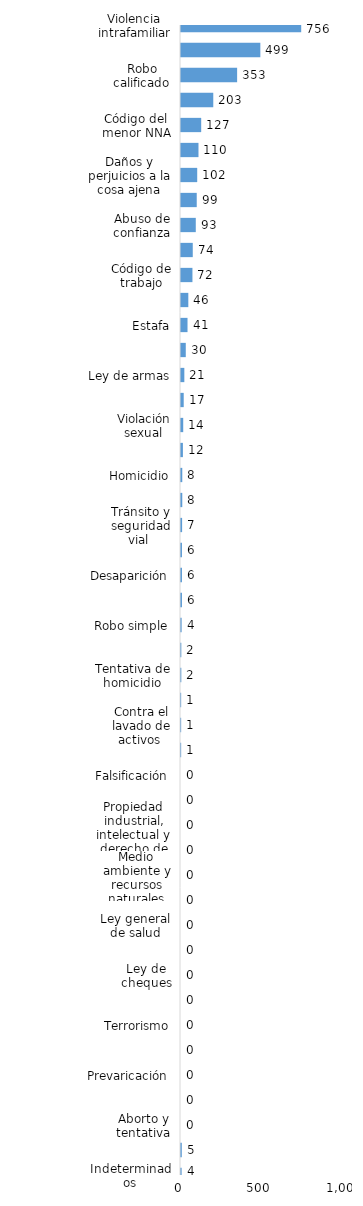
| Category | Series 0 |
|---|---|
| Violencia intrafamiliar | 756 |
| Amenaza | 499 |
| Robo calificado | 353 |
| Golpes y heridas | 203 |
| Código del menor NNA | 127 |
| Pérdida de documento de identidad | 110 |
| Daños y perjuicios a la cosa ajena | 102 |
| Crímenes y delitos de alta tecnología | 99 |
| Abuso de confianza | 93 |
| Asociación de malhechores | 74 |
| Código de trabajo | 72 |
| Violencia de género | 46 |
| Estafa | 41 |
| Droga, traficante de droga | 30 |
| Ley de armas | 21 |
| Agresión sexual | 17 |
| Violación sexual | 14 |
| Protección animal y tenencia responsable | 12 |
| Homicidio | 8 |
| Droga, sanciones y circunstancias agravantes | 8 |
| Tránsito y seguridad vial  | 7 |
| Crímenes y delitos contra la propiedad | 6 |
| Desaparición | 6 |
| Tráfico ilícito de migrantes y trata de personas | 6 |
| Robo simple | 4 |
| Droga, distribución de droga | 2 |
| Tentativa de homicidio | 2 |
| Droga, simple posesión | 1 |
| Contra el lavado de activos  | 1 |
| Proxenetismo | 1 |
| Falsificación | 0 |
| Difamación e injuria | 0 |
| Propiedad industrial, intelectual y derecho de autor | 0 |
| Conflictos sociales | 0 |
| Medio ambiente y recursos naturales | 0 |
| Secuestro | 0 |
| Ley general de salud | 0 |
| Juegos de azar | 0 |
| Ley de cheques | 0 |
| Derechos humanos | 0 |
| Terrorismo | 0 |
| Soborno | 0 |
| Prevaricación | 0 |
| Droga, delitos y sanciones | 0 |
| Aborto y tentativa | 0 |
| Otros | 5 |
| Indeterminados | 4 |